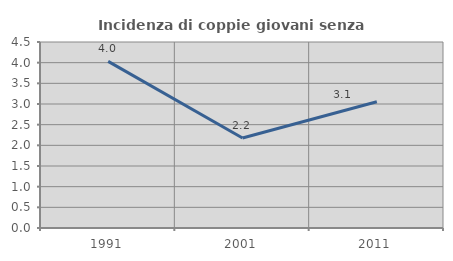
| Category | Incidenza di coppie giovani senza figli |
|---|---|
| 1991.0 | 4.032 |
| 2001.0 | 2.178 |
| 2011.0 | 3.055 |